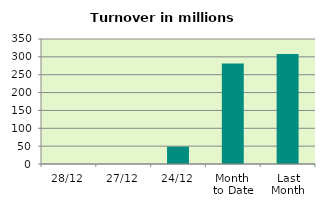
| Category | Series 0 |
|---|---|
| 28/12 | 0 |
| 27/12 | 0 |
| 24/12 | 48.614 |
| Month 
to Date | 281.259 |
| Last
Month | 307.664 |